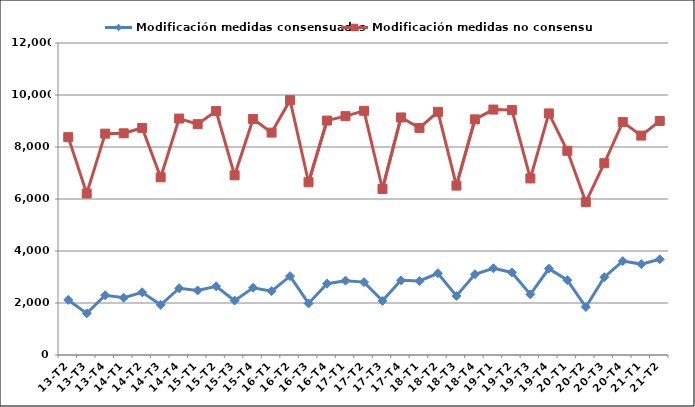
| Category | Modificación medidas consensuadas | Modificación medidas no consensuadas |
|---|---|---|
| 13-T2 | 2118 | 8379 |
| 13-T3 | 1602 | 6211 |
| 13-T4 | 2298 | 8514 |
| 14-T1 | 2203 | 8527 |
| 14-T2 | 2411 | 8733 |
| 14-T3 | 1929 | 6834 |
| 14-T4 | 2567 | 9094 |
| 15-T1 | 2483 | 8879 |
| 15-T2 | 2644 | 9382 |
| 15-T3 | 2092 | 6911 |
| 15-T4 | 2586 | 9076 |
| 16-T1 | 2455 | 8554 |
| 16-T2 | 3032 | 9802 |
| 16-T3 | 1983 | 6644 |
| 16-T4 | 2744 | 9017 |
| 17-T1 | 2859 | 9186 |
| 17-T2 | 2804 | 9391 |
| 17-T3 | 2082 | 6385 |
| 17-T4 | 2872 | 9137 |
| 18-T1 | 2846 | 8734 |
| 18-T2 | 3144 | 9353 |
| 18-T3 | 2272 | 6516 |
| 18-T4 | 3104 | 9063 |
| 19-T1 | 3335 | 9440 |
| 19-T2 | 3176 | 9426 |
| 19-T3 | 2332 | 6792 |
| 19-T4 | 3323 | 9291 |
| 20-T1 | 2880 | 7854 |
| 20-T2 | 1846 | 5880 |
| 20-T3 | 2991 | 7376 |
| 20-T4 | 3612 | 8960 |
| 21-T1 | 3496 | 8439 |
| 21-T2 | 3681 | 9002 |